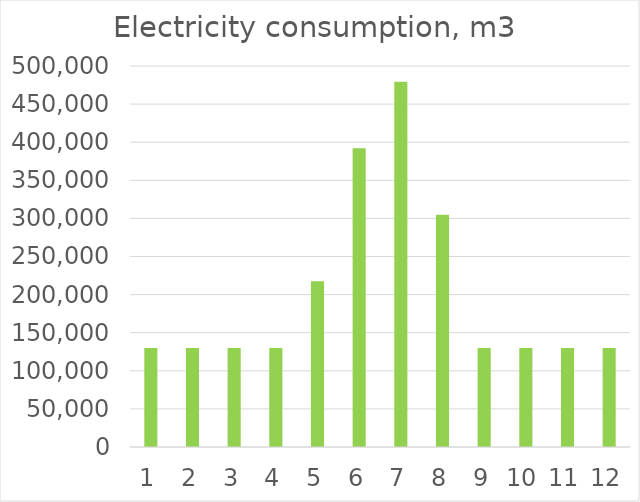
| Category | Series 0 |
|---|---|
| 0 | 130000 |
| 1 | 130000 |
| 2 | 130000 |
| 3 | 130000 |
| 4 | 217360 |
| 5 | 392080 |
| 6 | 479440 |
| 7 | 304720 |
| 8 | 130000 |
| 9 | 130000 |
| 10 | 130000 |
| 11 | 130000 |